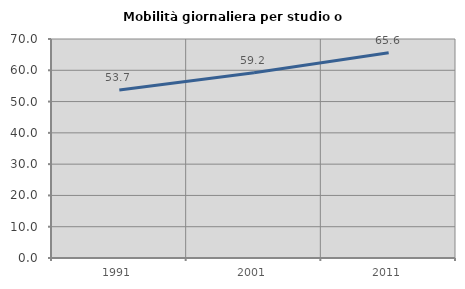
| Category | Mobilità giornaliera per studio o lavoro |
|---|---|
| 1991.0 | 53.699 |
| 2001.0 | 59.202 |
| 2011.0 | 65.577 |